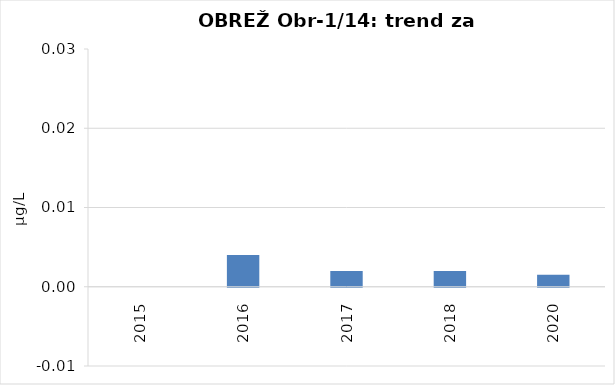
| Category | Vsota |
|---|---|
| 2015 | 0 |
| 2016 | 0.004 |
| 2017 | 0.002 |
| 2018 | 0.002 |
| 2020 | 0.002 |